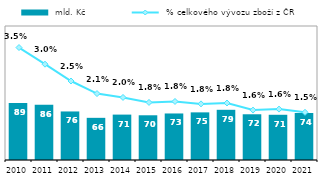
| Category |  mld. Kč |
|---|---|
| 2010.0 | 89.274 |
| 2011.0 | 86.46 |
| 2012.0 | 76.073 |
| 2013.0 | 66.078 |
| 2014.0 | 71.144 |
| 2015.0 | 70.087 |
| 2016.0 | 72.922 |
| 2017.0 | 74.65 |
| 2018.0 | 78.676 |
| 2019.0 | 71.661 |
| 2020.0 | 70.864 |
| 2021.0 | 73.694 |